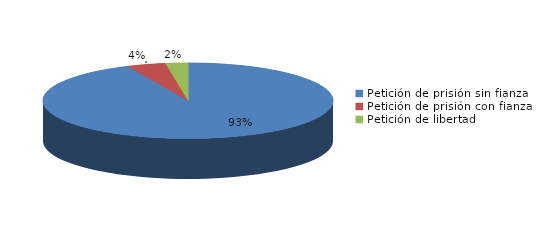
| Category | Series 0 |
|---|---|
| Petición de prisión sin fianza | 412 |
| Petición de prisión con fianza | 19 |
| Petición de libertad | 11 |